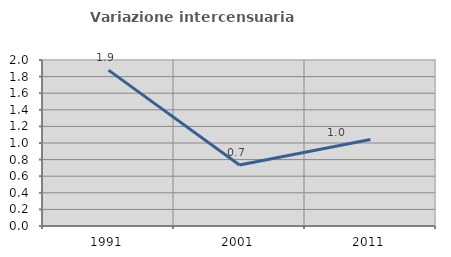
| Category | Variazione intercensuaria annua |
|---|---|
| 1991.0 | 1.878 |
| 2001.0 | 0.735 |
| 2011.0 | 1.042 |